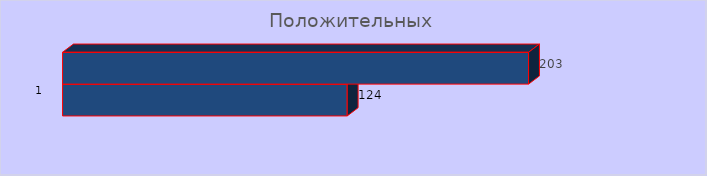
| Category | положительных | Series 0 |
|---|---|---|
| 0 | 124 | 203 |